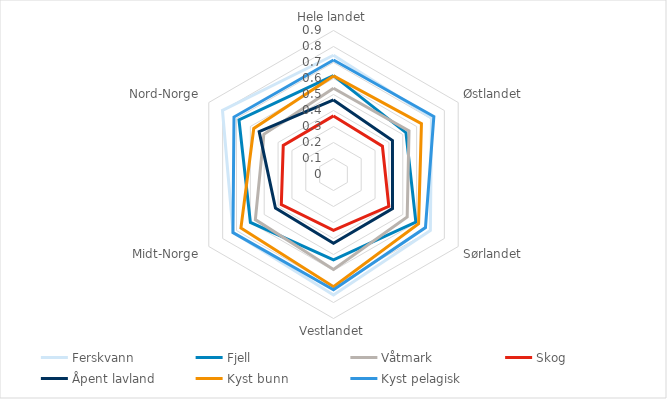
| Category | Ferskvann | Fjell | Våtmark | Skog | Åpent lavland | Kyst bunn | Kyst pelagisk  |
|---|---|---|---|---|---|---|---|
| Hele landet | 0.745 | 0.618 | 0.539 | 0.366 | 0.466 | 0.616 | 0.716 |
| Østlandet | 0.707 | 0.523 | 0.545 | 0.353 | 0.426 | 0.635 | 0.724 |
| Sørlandet | 0.699 | 0.594 | 0.532 | 0.399 | 0.426 | 0.614 | 0.664 |
| Vestlandet | 0.754 | 0.533 | 0.593 | 0.349 | 0.43 | 0.702 | 0.721 |
| Midt-Norge | 0.725 | 0.6 | 0.564 | 0.377 | 0.419 | 0.668 | 0.726 |
| Nord-Norge | 0.801 | 0.682 | 0.503 | 0.363 | 0.537 | 0.576 | 0.718 |